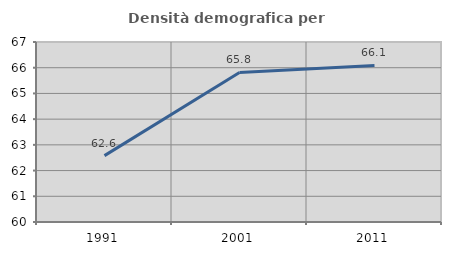
| Category | Densità demografica |
|---|---|
| 1991.0 | 62.582 |
| 2001.0 | 65.817 |
| 2011.0 | 66.087 |